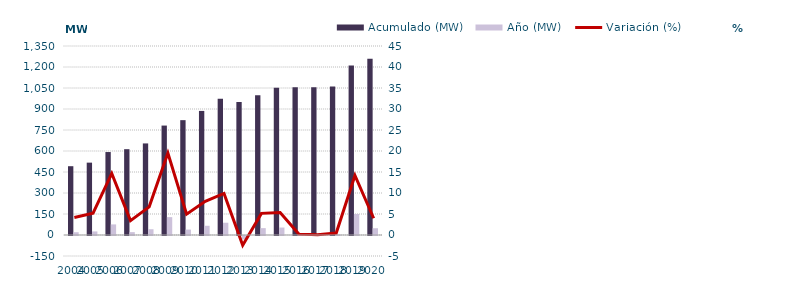
| Category | Acumulado (MW) | Año (MW) |
|---|---|---|
| 2004.0 | 491.375 | 19.731 |
| 2005.0 | 516.874 | 25.5 |
| 2006.0 | 592.628 | 75.754 |
| 2007.0 | 612.965 | 20.336 |
| 2008.0 | 654.063 | 41.098 |
| 2009.0 | 781.673 | 127.61 |
| 2010.0 | 820.352 | 38.679 |
| 2011.0 | 886.288 | 65.936 |
| 2012.0 | 973.93 | 87.643 |
| 2013.0 | 949.94 | -23.99 |
| 2014.0 | 998.853 | 48.913 |
| 2015.0 | 1052.11 | 53.257 |
| 2016.0 | 1054.733 | 2.623 |
| 2017.0 | 1055.491 | 0.758 |
| 2018.0 | 1060.384 | 4.893 |
| 2019.0 | 1210.609 | 150.225 |
| 2020.0 | 1258.937 | 48.328 |